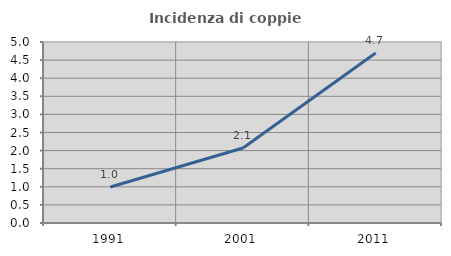
| Category | Incidenza di coppie miste |
|---|---|
| 1991.0 | 0.996 |
| 2001.0 | 2.07 |
| 2011.0 | 4.696 |